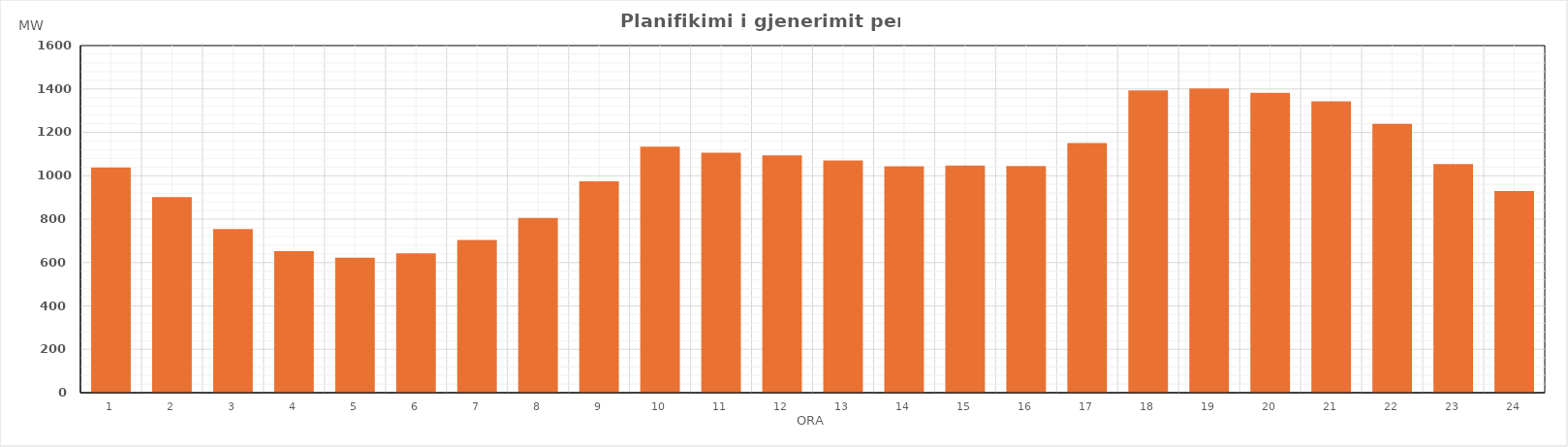
| Category | Max (MW) |
|---|---|
| 0 | 1038.26 |
| 1 | 902.05 |
| 2 | 754.65 |
| 3 | 651.98 |
| 4 | 622.67 |
| 5 | 643 |
| 6 | 703.41 |
| 7 | 806.14 |
| 8 | 974.01 |
| 9 | 1133.95 |
| 10 | 1106.12 |
| 11 | 1094.14 |
| 12 | 1070.51 |
| 13 | 1044.1 |
| 14 | 1047.13 |
| 15 | 1044.99 |
| 16 | 1150.83 |
| 17 | 1393.15 |
| 18 | 1402.36 |
| 19 | 1382.1 |
| 20 | 1342.89 |
| 21 | 1238.97 |
| 22 | 1054.17 |
| 23 | 929.26 |